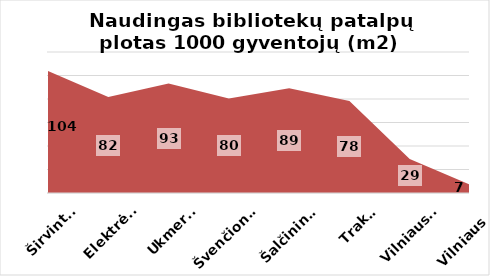
| Category | Series 0 |
|---|---|
| Širvintos | 103.769 |
| Elektrėnai | 81.638 |
| Ukmergė | 93.214 |
| Švenčionys | 80.466 |
| Šalčininkai | 89.086 |
| Trakai | 78.301 |
| Vilniaus r. | 28.978 |
| Vilniaus m. | 7.022 |